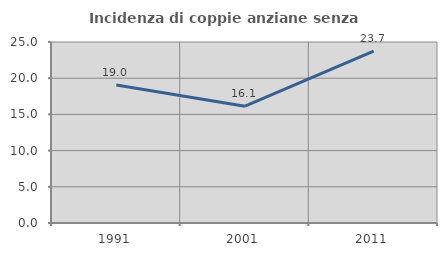
| Category | Incidenza di coppie anziane senza figli  |
|---|---|
| 1991.0 | 19.048 |
| 2001.0 | 16.129 |
| 2011.0 | 23.729 |